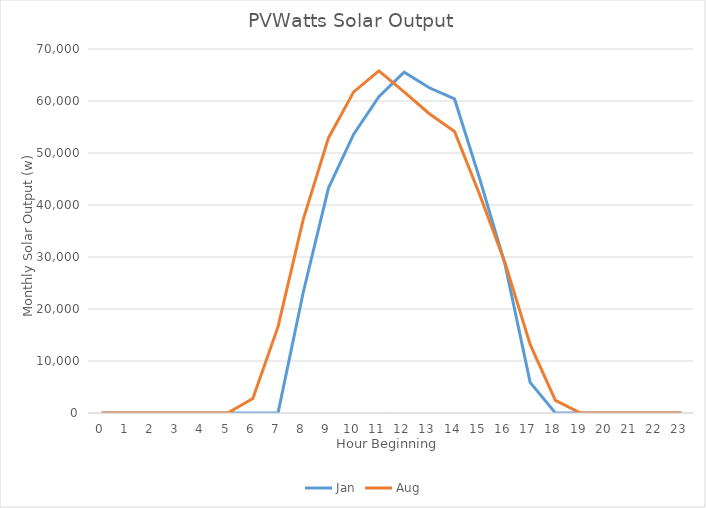
| Category | Jan | Aug |
|---|---|---|
| 0.0 | 0 | 0 |
| 1.0 | 0 | 0 |
| 2.0 | 0 | 0 |
| 3.0 | 0 | 0 |
| 4.0 | 0 | 0 |
| 5.0 | 0 | 0 |
| 6.0 | 0 | 2798.376 |
| 7.0 | 15.333 | 16598.978 |
| 8.0 | 23219.641 | 37254.89 |
| 9.0 | 43264.591 | 52901.349 |
| 10.0 | 53617.267 | 61751.859 |
| 11.0 | 60844.539 | 65778.011 |
| 12.0 | 65529.266 | 61739.352 |
| 13.0 | 62544.888 | 57559.322 |
| 14.0 | 60396.074 | 54141.724 |
| 15.0 | 45020.624 | 41969.575 |
| 16.0 | 28656.582 | 28942.373 |
| 17.0 | 5897.122 | 13199.883 |
| 18.0 | 0 | 2442.167 |
| 19.0 | 0 | 0 |
| 20.0 | 0 | 0 |
| 21.0 | 0 | 0 |
| 22.0 | 0 | 0 |
| 23.0 | 0 | 0 |